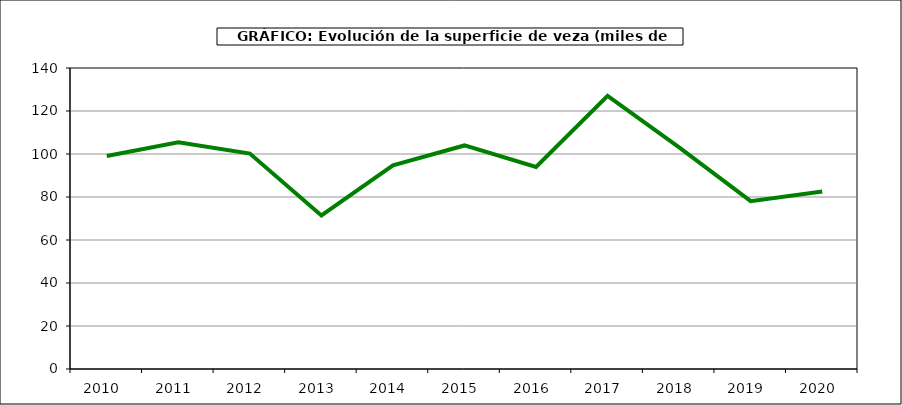
| Category | Superficie |
|---|---|
| 2010.0 | 99.058 |
| 2011.0 | 105.49 |
| 2012.0 | 100.2 |
| 2013.0 | 71.44 |
| 2014.0 | 94.69 |
| 2015.0 | 103.977 |
| 2016.0 | 94.001 |
| 2017.0 | 127.005 |
| 2018.0 | 103.116 |
| 2019.0 | 78.055 |
| 2020.0 | 82.58 |